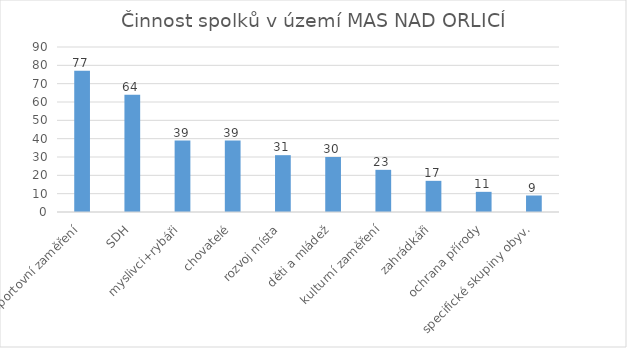
| Category | Series 0 |
|---|---|
| sportovní zaměření | 77 |
| SDH | 64 |
| myslivci+rybáři | 39 |
| chovatelé | 39 |
| rozvoj místa | 31 |
| děti a mládež | 30 |
| kulturní zaměření | 23 |
| zahrádkáři | 17 |
| ochrana přírody | 11 |
| specifické skupiny obyv. | 9 |